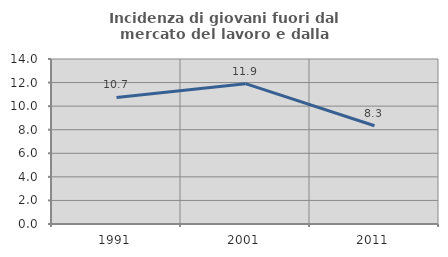
| Category | Incidenza di giovani fuori dal mercato del lavoro e dalla formazione  |
|---|---|
| 1991.0 | 10.734 |
| 2001.0 | 11.905 |
| 2011.0 | 8.333 |